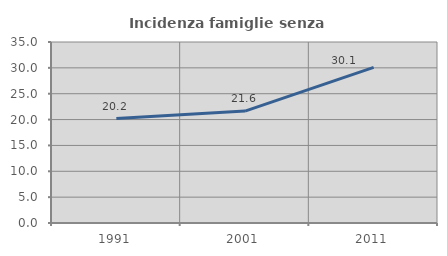
| Category | Incidenza famiglie senza nuclei |
|---|---|
| 1991.0 | 20.187 |
| 2001.0 | 21.642 |
| 2011.0 | 30.102 |